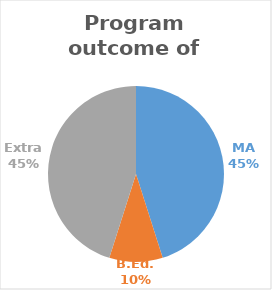
| Category | Series 0 |
|---|---|
| MA | 23 |
| B.Ed. | 5 |
| Extra | 23 |